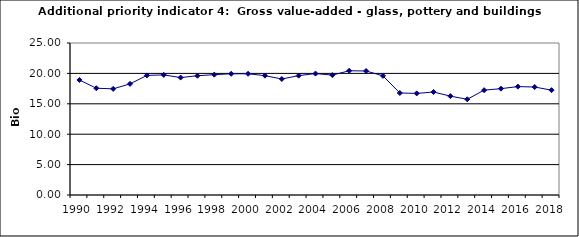
| Category | Gross value-added - glass, pottery and buildings materials industry, Bio Euro (EC95) |
|---|---|
| 1990 | 18.919 |
| 1991 | 17.564 |
| 1992 | 17.457 |
| 1993 | 18.277 |
| 1994 | 19.668 |
| 1995 | 19.757 |
| 1996 | 19.311 |
| 1997 | 19.614 |
| 1998 | 19.792 |
| 1999 | 19.935 |
| 2000 | 19.935 |
| 2001 | 19.632 |
| 2002 | 19.079 |
| 2003 | 19.632 |
| 2004 | 19.971 |
| 2005 | 19.721 |
| 2006 | 20.434 |
| 2007 | 20.399 |
| 2008 | 19.596 |
| 2009 | 16.779 |
| 2010 | 16.708 |
| 2011 | 16.939 |
| 2012 | 16.262 |
| 2013 | 15.745 |
| 2014 | 17.243 |
| 2015 | 17.492 |
| 2016 | 17.831 |
| 2017 | 17.76 |
| 2018 | 17.243 |